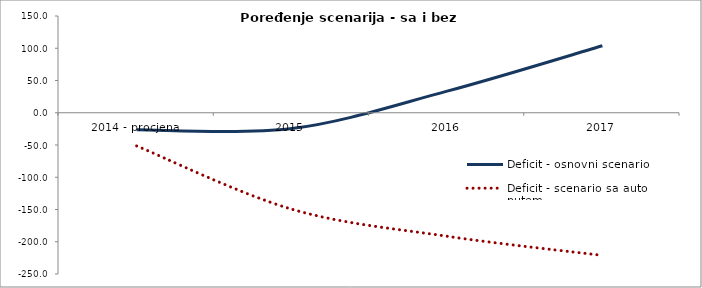
| Category | Deficit - osnovni scenario | Deficit - scenario sa auto putem |
|---|---|---|
| 2014 - procjena | -26424601.993 | -51424601.993 |
| 2015 | -24569497.373 | -149569497.373 |
| 2016 | 33498994.006 | -191501005.994 |
| 2017 | 103834080.126 | -221165919.874 |